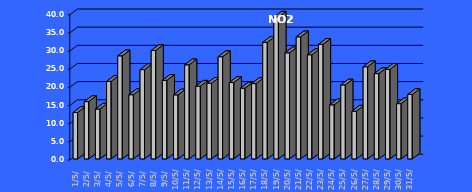
| Category | NO2 [µg/m3] |
|---|---|
| 2023-05-01 | 12.788 |
| 2023-05-02 | 15.776 |
| 2023-05-03 | 13.728 |
| 2023-05-04 | 21.34 |
| 2023-05-05 | 28.385 |
| 2023-05-06 | 17.678 |
| 2023-05-07 | 24.581 |
| 2023-05-08 | 29.859 |
| 2023-05-09 | 21.643 |
| 2023-05-10 | 17.631 |
| 2023-05-11 | 25.904 |
| 2023-05-12 | 20.032 |
| 2023-05-13 | 20.823 |
| 2023-05-14 | 28.143 |
| 2023-05-15 | 21.035 |
| 2023-05-16 | 19.47 |
| 2023-05-17 | 20.734 |
| 2023-05-18 | 32.1 |
| 2023-05-19 | 39.046 |
| 2023-05-20 | 29.227 |
| 2023-05-21 | 33.612 |
| 2023-05-22 | 28.672 |
| 2023-05-23 | 31.558 |
| 2023-05-24 | 14.885 |
| 2023-05-25 | 20.374 |
| 2023-05-26 | 13.147 |
| 2023-05-27 | 25.38 |
| 2023-05-28 | 23.495 |
| 2023-05-29 | 24.657 |
| 2023-05-30 | 15.219 |
| 2023-05-31 | 17.738 |